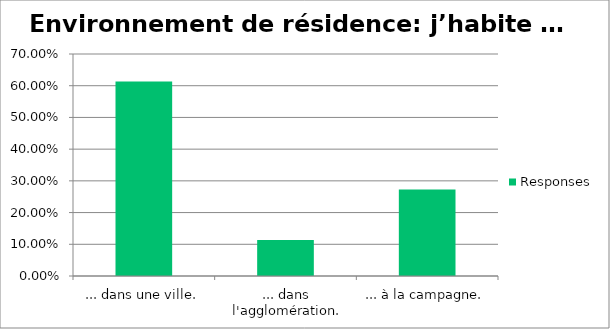
| Category | Responses |
|---|---|
| ... dans une ville. | 0.614 |
| ... dans l'agglomération. | 0.114 |
| ... à la campagne. | 0.273 |